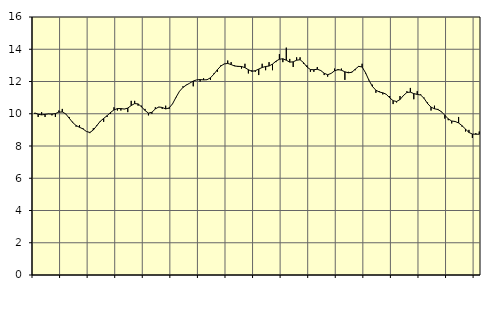
| Category | Piggar | Series 1 |
|---|---|---|
| nan | 10 | 10.05 |
| 87.0 | 9.8 | 9.97 |
| 87.0 | 10.1 | 9.93 |
| 87.0 | 9.8 | 9.96 |
| nan | 10 | 9.99 |
| 88.0 | 9.9 | 9.98 |
| 88.0 | 9.8 | 10.01 |
| 88.0 | 10.2 | 10.1 |
| nan | 10.3 | 10.11 |
| 89.0 | 10 | 9.99 |
| 89.0 | 9.8 | 9.73 |
| 89.0 | 9.5 | 9.46 |
| nan | 9.2 | 9.27 |
| 90.0 | 9.3 | 9.16 |
| 90.0 | 9.1 | 9.06 |
| 90.0 | 8.9 | 8.9 |
| nan | 8.8 | 8.84 |
| 91.0 | 9.1 | 8.99 |
| 91.0 | 9.3 | 9.26 |
| 91.0 | 9.5 | 9.53 |
| nan | 9.5 | 9.71 |
| 92.0 | 9.8 | 9.88 |
| 92.0 | 10 | 10.08 |
| 92.0 | 10.4 | 10.24 |
| nan | 10.2 | 10.32 |
| 93.0 | 10.2 | 10.32 |
| 93.0 | 10.3 | 10.29 |
| 93.0 | 10.1 | 10.35 |
| nan | 10.8 | 10.51 |
| 94.0 | 10.8 | 10.63 |
| 94.0 | 10.5 | 10.61 |
| 94.0 | 10.5 | 10.43 |
| nan | 10.3 | 10.2 |
| 95.0 | 9.9 | 10.04 |
| 95.0 | 10 | 10.09 |
| 95.0 | 10.4 | 10.3 |
| nan | 10.4 | 10.42 |
| 96.0 | 10.3 | 10.39 |
| 96.0 | 10.5 | 10.3 |
| 96.0 | 10.3 | 10.36 |
| nan | 10.6 | 10.62 |
| 97.0 | 11 | 11.02 |
| 97.0 | 11.4 | 11.39 |
| 97.0 | 11.7 | 11.63 |
| nan | 11.8 | 11.78 |
| 98.0 | 11.9 | 11.9 |
| 98.0 | 11.7 | 12.03 |
| 98.0 | 12.1 | 12.1 |
| nan | 12 | 12.12 |
| 99.0 | 12.2 | 12.1 |
| 99.0 | 12.1 | 12.11 |
| 99.0 | 12.1 | 12.23 |
| nan | 12.5 | 12.46 |
| 0.0 | 12.6 | 12.73 |
| 0.0 | 13 | 12.96 |
| 0.0 | 13.1 | 13.09 |
| nan | 13.3 | 13.12 |
| 1.0 | 13.2 | 13.05 |
| 1.0 | 13 | 12.96 |
| 1.0 | 12.9 | 12.94 |
| nan | 12.8 | 12.93 |
| 2.0 | 13.1 | 12.86 |
| 2.0 | 12.5 | 12.73 |
| 2.0 | 12.7 | 12.63 |
| nan | 12.6 | 12.67 |
| 3.0 | 12.4 | 12.77 |
| 3.0 | 13.1 | 12.87 |
| 3.0 | 12.7 | 12.93 |
| nan | 13.2 | 12.96 |
| 4.0 | 12.7 | 13.08 |
| 4.0 | 13.2 | 13.26 |
| 4.0 | 13.7 | 13.38 |
| nan | 13.2 | 13.41 |
| 5.0 | 14.1 | 13.32 |
| 5.0 | 13.4 | 13.2 |
| 5.0 | 12.9 | 13.22 |
| nan | 13.5 | 13.32 |
| 6.0 | 13.5 | 13.35 |
| 6.0 | 13.1 | 13.17 |
| 6.0 | 13 | 12.9 |
| nan | 12.6 | 12.74 |
| 7.0 | 12.6 | 12.73 |
| 7.0 | 12.9 | 12.76 |
| 7.0 | 12.7 | 12.68 |
| nan | 12.4 | 12.51 |
| 8.0 | 12.3 | 12.42 |
| 8.0 | 12.5 | 12.5 |
| 8.0 | 12.8 | 12.66 |
| nan | 12.7 | 12.74 |
| 9.0 | 12.8 | 12.7 |
| 9.0 | 12.1 | 12.6 |
| 9.0 | 12.6 | 12.54 |
| nan | 12.6 | 12.57 |
| 10.0 | 12.7 | 12.76 |
| 10.0 | 12.9 | 12.94 |
| 10.0 | 13.1 | 12.9 |
| nan | 12.5 | 12.54 |
| 11.0 | 12.1 | 12.07 |
| 11.0 | 11.8 | 11.69 |
| 11.0 | 11.3 | 11.46 |
| nan | 11.4 | 11.35 |
| 12.0 | 11.2 | 11.3 |
| 12.0 | 11.2 | 11.21 |
| 12.0 | 11.1 | 10.99 |
| nan | 10.6 | 10.81 |
| 13.0 | 10.7 | 10.76 |
| 13.0 | 11.1 | 10.88 |
| 13.0 | 11.1 | 11.13 |
| nan | 11.4 | 11.32 |
| 14.0 | 11.6 | 11.34 |
| 14.0 | 10.9 | 11.25 |
| 14.0 | 11.4 | 11.2 |
| nan | 11.2 | 11.16 |
| 15.0 | 11 | 10.95 |
| 15.0 | 10.7 | 10.63 |
| 15.0 | 10.2 | 10.41 |
| nan | 10.5 | 10.31 |
| 16.0 | 10.3 | 10.26 |
| 16.0 | 10.1 | 10.13 |
| 16.0 | 9.7 | 9.91 |
| nan | 9.6 | 9.68 |
| 17.0 | 9.4 | 9.55 |
| 17.0 | 9.5 | 9.52 |
| 17.0 | 9.8 | 9.43 |
| nan | 9.2 | 9.26 |
| 18.0 | 8.9 | 9.05 |
| 18.0 | 9 | 8.84 |
| 18.0 | 8.5 | 8.74 |
| nan | 8.8 | 8.73 |
| 19.0 | 8.9 | 8.73 |